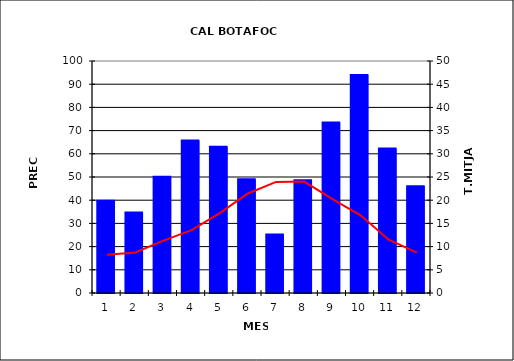
| Category | Series 0 |
|---|---|
| 0 | 39.757 |
| 1 | 34.689 |
| 2 | 50.114 |
| 3 | 65.754 |
| 4 | 63.082 |
| 5 | 49.071 |
| 6 | 25.264 |
| 7 | 48.546 |
| 8 | 73.532 |
| 9 | 93.964 |
| 10 | 62.232 |
| 11 | 45.966 |